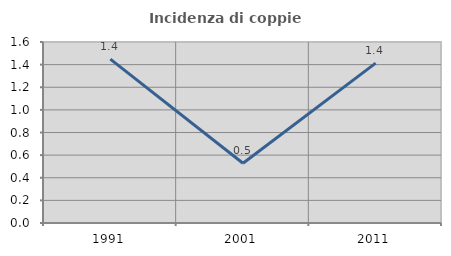
| Category | Incidenza di coppie miste |
|---|---|
| 1991.0 | 1.449 |
| 2001.0 | 0.528 |
| 2011.0 | 1.413 |